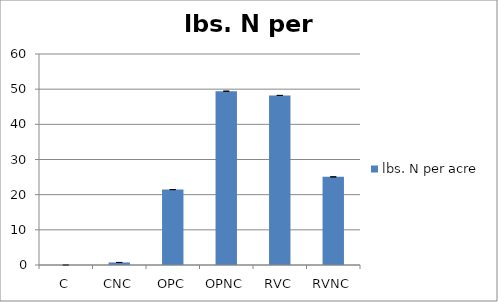
| Category | lbs. N per acre |
|---|---|
| C | 0 |
| CNC | 0.722 |
| OPC | 21.44 |
| OPNC | 49.42 |
| RVC | 48.22 |
| RVNC | 25.06 |